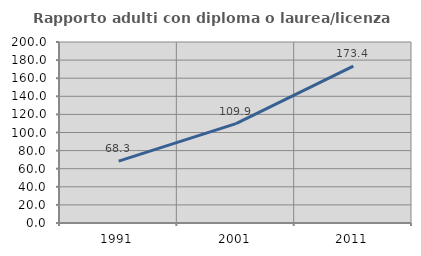
| Category | Rapporto adulti con diploma o laurea/licenza media  |
|---|---|
| 1991.0 | 68.318 |
| 2001.0 | 109.855 |
| 2011.0 | 173.373 |